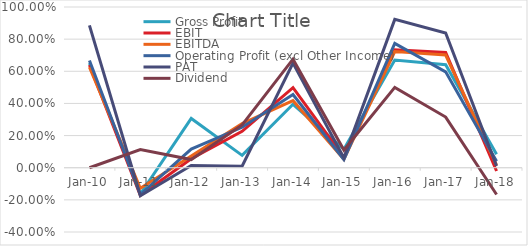
| Category | Gross Profit | EBIT | EBITDA | Operating Profit (excl Other Income) | PAT | Dividend |
|---|---|---|---|---|---|---|
| 2010-03-31 | 0.652 | 0.639 | 0.626 | 0.667 | 0.886 | 0 |
| 2011-03-31 | -0.164 | -0.172 | -0.128 | -0.167 | -0.175 | 0.113 |
| 2012-03-31 | 0.306 | 0.056 | 0.073 | 0.116 | 0.014 | 0.051 |
| 2013-03-31 | 0.077 | 0.227 | 0.274 | 0.252 | 0.009 | 0.266 |
| 2014-03-31 | 0.395 | 0.498 | 0.417 | 0.455 | 0.651 | 0.675 |
| 2015-03-31 | 0.115 | 0.065 | 0.052 | 0.051 | 0.061 | 0.11 |
| 2016-03-31 | 0.67 | 0.734 | 0.723 | 0.774 | 0.923 | 0.5 |
| 2017-03-31 | 0.641 | 0.717 | 0.701 | 0.596 | 0.838 | 0.315 |
| 2018-03-31 | 0.083 | -0.02 | 0.016 | 0.04 | 0.011 | -0.167 |